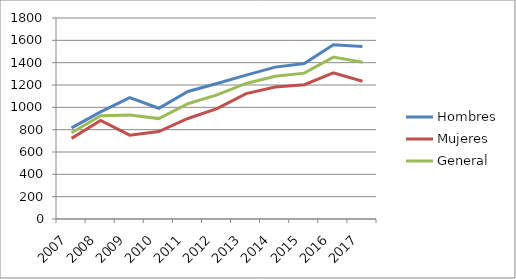
| Category | Hombres | Mujeres | General |
|---|---|---|---|
| 2007.0 | 816 | 722 | 773 |
| 2008.0 | 959 | 883 | 925 |
| 2009.0 | 1087 | 751 | 932 |
| 2010.0 | 992 | 783 | 899 |
| 2011.0 | 1142 | 900 | 1032 |
| 2012.0 | 1213 | 988 | 1112 |
| 2013.0 | 1288 | 1123 | 1214 |
| 2014.0 | 1360 | 1182 | 1279 |
| 2015.0 | 1393 | 1203 | 1306 |
| 2016.0 | 1561 | 1309 | 1450 |
| 2017.0 | 1544 | 1234 | 1403 |